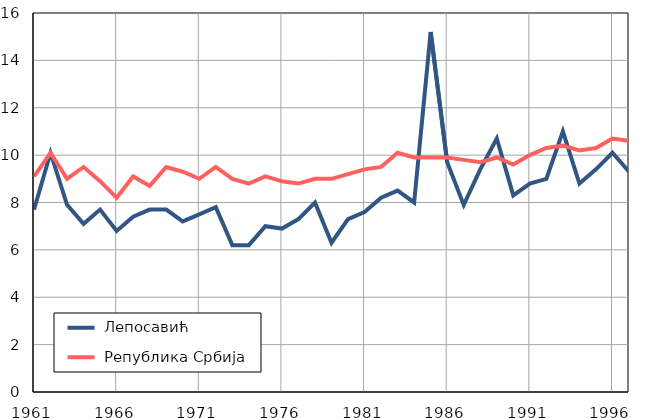
| Category |  Лепосавић |  Република Србија |
|---|---|---|
| 1961.0 | 7.7 | 9.1 |
| 1962.0 | 10.1 | 10.1 |
| 1963.0 | 7.9 | 9 |
| 1964.0 | 7.1 | 9.5 |
| 1965.0 | 7.7 | 8.9 |
| 1966.0 | 6.8 | 8.2 |
| 1967.0 | 7.4 | 9.1 |
| 1968.0 | 7.7 | 8.7 |
| 1969.0 | 7.7 | 9.5 |
| 1970.0 | 7.2 | 9.3 |
| 1971.0 | 7.5 | 9 |
| 1972.0 | 7.8 | 9.5 |
| 1973.0 | 6.2 | 9 |
| 1974.0 | 6.2 | 8.8 |
| 1975.0 | 7 | 9.1 |
| 1976.0 | 6.9 | 8.9 |
| 1977.0 | 7.3 | 8.8 |
| 1978.0 | 8 | 9 |
| 1979.0 | 6.3 | 9 |
| 1980.0 | 7.3 | 9.2 |
| 1981.0 | 7.6 | 9.4 |
| 1982.0 | 8.2 | 9.5 |
| 1983.0 | 8.5 | 10.1 |
| 1984.0 | 8 | 9.9 |
| 1985.0 | 15.2 | 9.9 |
| 1986.0 | 9.7 | 9.9 |
| 1987.0 | 7.9 | 9.8 |
| 1988.0 | 9.4 | 9.7 |
| 1989.0 | 10.7 | 9.9 |
| 1990.0 | 8.3 | 9.6 |
| 1991.0 | 8.8 | 10 |
| 1992.0 | 9 | 10.3 |
| 1993.0 | 11 | 10.4 |
| 1994.0 | 8.8 | 10.2 |
| 1995.0 | 9.4 | 10.3 |
| 1996.0 | 10.1 | 10.7 |
| 1997.0 | 9.3 | 10.6 |